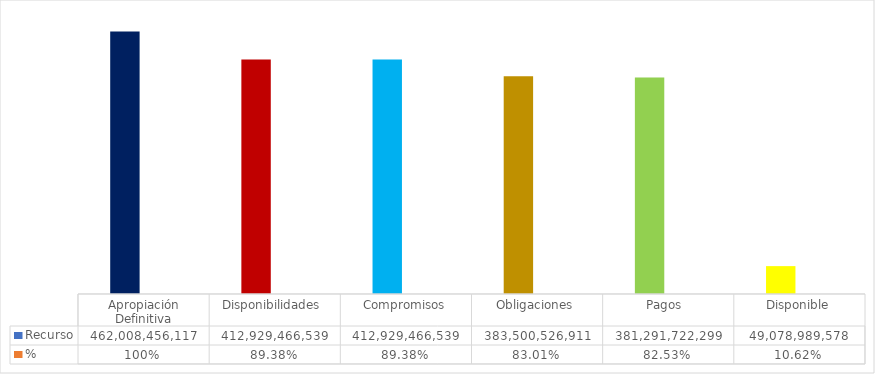
| Category | Recurso  | % |
|---|---|---|
| Apropiación Definitiva | 462008456116.51 | 1 |
| Disponibilidades  | 412929466538.8 | 0.894 |
| Compromisos | 412929466538.8 | 0.894 |
| Obligaciones | 383500526911.46 | 0.83 |
| Pagos  | 381291722299.3 | 0.825 |
| Disponible | 49078989577.71 | 0.106 |